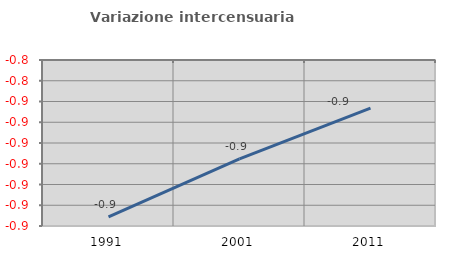
| Category | Variazione intercensuaria annua |
|---|---|
| 1991.0 | -0.906 |
| 2001.0 | -0.878 |
| 2011.0 | -0.853 |